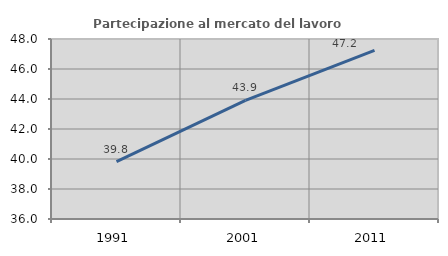
| Category | Partecipazione al mercato del lavoro  femminile |
|---|---|
| 1991.0 | 39.829 |
| 2001.0 | 43.909 |
| 2011.0 | 47.24 |